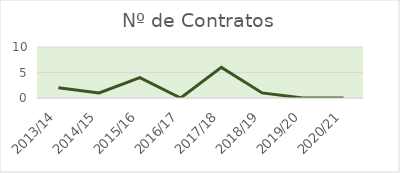
| Category | Contratos |
|---|---|
| 2013/14 | 2 |
| 2014/15 | 1 |
| 2015/16 | 4 |
| 2016/17 | 0 |
| 2017/18 | 6 |
| 2018/19 | 1 |
| 2019/20 | 0 |
| 2020/21 | 0 |